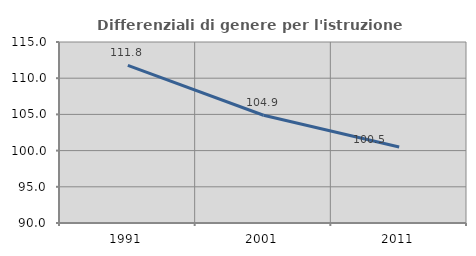
| Category | Differenziali di genere per l'istruzione superiore |
|---|---|
| 1991.0 | 111.784 |
| 2001.0 | 104.883 |
| 2011.0 | 100.501 |